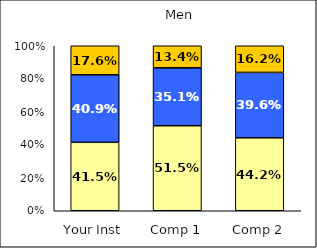
| Category | Low College Reputation Orientation | Average College Reputation Orientation | High College Reputation Orientation |
|---|---|---|---|
| Your Inst | 0.415 | 0.409 | 0.176 |
| Comp 1 | 0.515 | 0.351 | 0.134 |
| Comp 2 | 0.442 | 0.396 | 0.162 |